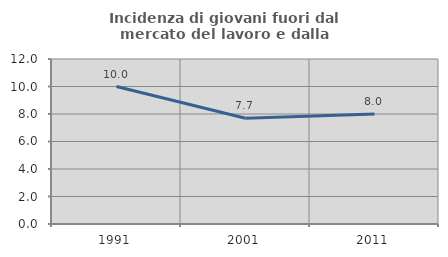
| Category | Incidenza di giovani fuori dal mercato del lavoro e dalla formazione  |
|---|---|
| 1991.0 | 10 |
| 2001.0 | 7.692 |
| 2011.0 | 8 |